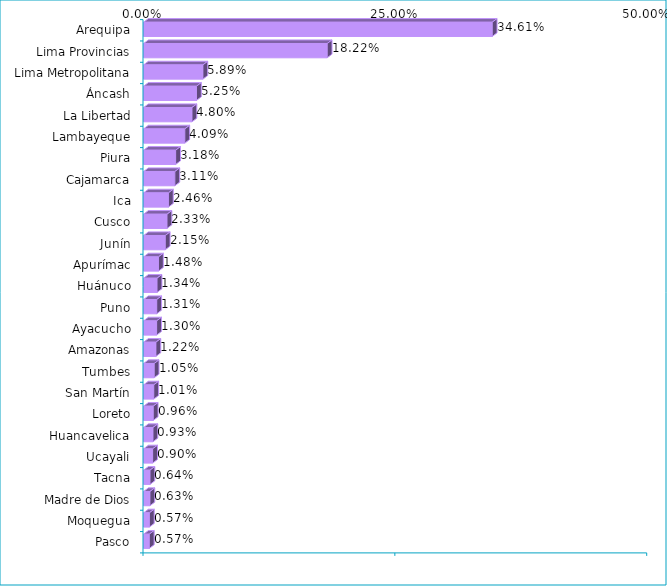
| Category | Series 0 |
|---|---|
| Arequipa | 0.346 |
| Lima Provincias | 0.182 |
| Lima Metropolitana | 0.059 |
| Áncash | 0.052 |
| La Libertad | 0.048 |
| Lambayeque | 0.041 |
| Piura | 0.032 |
| Cajamarca | 0.031 |
| Ica | 0.025 |
| Cusco | 0.023 |
| Junín | 0.022 |
| Apurímac | 0.015 |
| Huánuco | 0.013 |
| Puno | 0.013 |
| Ayacucho | 0.013 |
| Amazonas | 0.012 |
| Tumbes | 0.011 |
| San Martín | 0.01 |
| Loreto | 0.01 |
| Huancavelica | 0.009 |
| Ucayali | 0.009 |
| Tacna | 0.006 |
| Madre de Dios | 0.006 |
| Moquegua | 0.006 |
| Pasco | 0.006 |